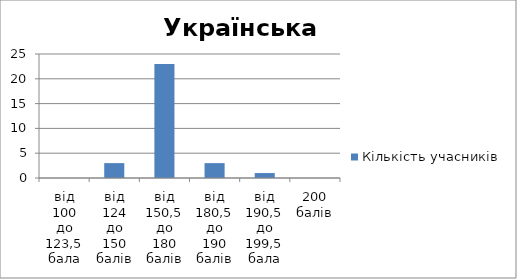
| Category | Кількість учасників |
|---|---|
| від 100 до 123,5 бала | 0 |
| від 124 до 150 балів | 3 |
| від 150,5 до 180 балів | 23 |
| від 180,5 до 190 балів | 3 |
| від 190,5 до 199,5 бала | 1 |
| 200 балів | 0 |